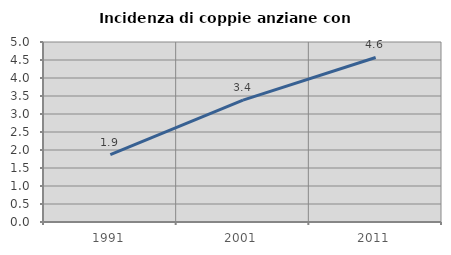
| Category | Incidenza di coppie anziane con figli |
|---|---|
| 1991.0 | 1.874 |
| 2001.0 | 3.385 |
| 2011.0 | 4.57 |